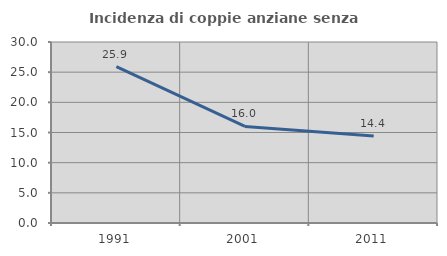
| Category | Incidenza di coppie anziane senza figli  |
|---|---|
| 1991.0 | 25.926 |
| 2001.0 | 16 |
| 2011.0 | 14.423 |